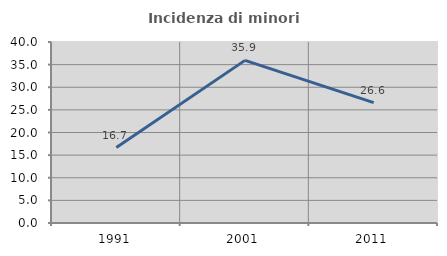
| Category | Incidenza di minori stranieri |
|---|---|
| 1991.0 | 16.667 |
| 2001.0 | 35.938 |
| 2011.0 | 26.608 |